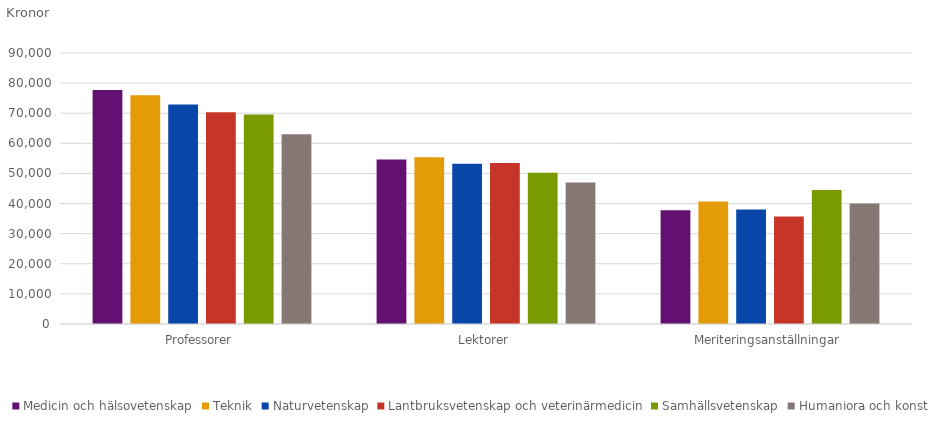
| Category | Medicin och hälsovetenskap | Teknik | Naturvetenskap | Lantbruksvetenskap och veterinärmedicin | Samhällsvetenskap | Humaniora och konst |
|---|---|---|---|---|---|---|
| Professorer | 77700 | 76000 | 72900 | 70300 | 69600 | 63000 |
| Lektorer | 54600 | 55400 | 53200 | 53500 | 50200 | 47000 |
| Meriteringsanställningar | 37800 | 40700 | 38000 | 35700 | 44500 | 40000 |